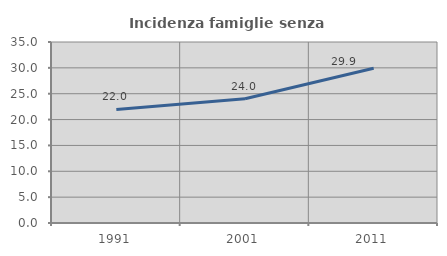
| Category | Incidenza famiglie senza nuclei |
|---|---|
| 1991.0 | 21.961 |
| 2001.0 | 24.036 |
| 2011.0 | 29.918 |